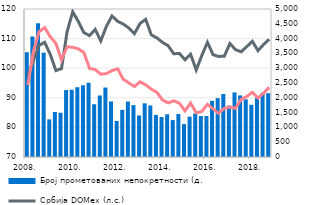
| Category | Број прометованих непокретности (д.с.)  |
|---|---|
| 2008. | 3540 |
| II | 4071 |
| III | 4515 |
| IV | 3524 |
| 2009. | 1271 |
| II | 1521 |
| III | 1495 |
| IV | 2262 |
| 2010. | 2272 |
| II | 2357 |
| III | 2422 |
| IV | 2508 |
| 2011. | 1782 |
| II | 2078 |
| III | 2347 |
| IV | 1877 |
| 2012. | 1218 |
| II | 1592 |
| III | 1875 |
| IV | 1752 |
| 2013. | 1403 |
| II | 1813 |
| III | 1741 |
| IV | 1424 |
| 2014. | 1351 |
| II | 1443 |
| III | 1247 |
| IV | 1451 |
| 2015. | 1113 |
| II | 1363 |
| III | 1466 |
| IV | 1385 |
| 2016. | 1384 |
| II | 1897 |
| III | 1989 |
| IV | 2128 |
| 2017. | 1735 |
| II | 2181 |
| III | 2081 |
| IV | 1948 |
| 2018. | 1765 |
| II | 1999 |
| III | 2171 |
| IV | 2154 |